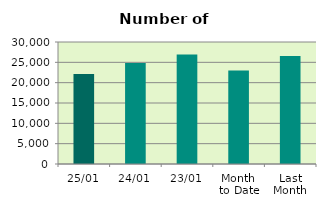
| Category | Series 0 |
|---|---|
| 25/01 | 22102 |
| 24/01 | 24848 |
| 23/01 | 26912 |
| Month 
to Date | 23014.889 |
| Last
Month | 26558.947 |